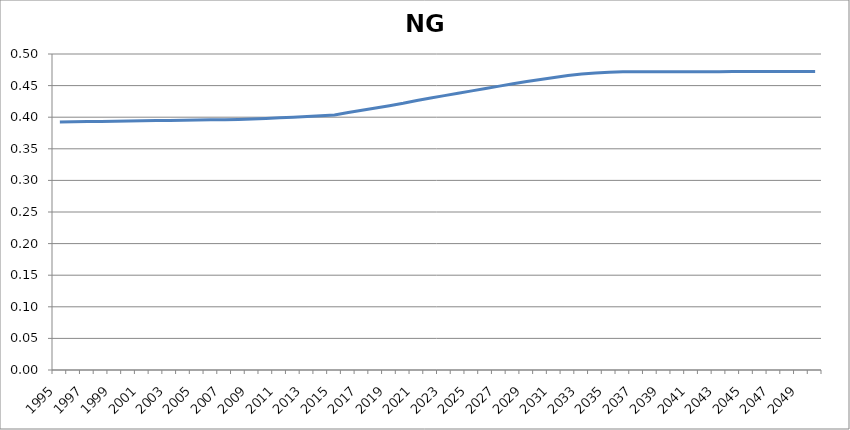
| Category | NGDryer |
|---|---|
| 1995.0 | 0.392 |
| 1996.0 | 0.393 |
| 1997.0 | 0.393 |
| 1998.0 | 0.393 |
| 1999.0 | 0.394 |
| 2000.0 | 0.394 |
| 2001.0 | 0.394 |
| 2002.0 | 0.395 |
| 2003.0 | 0.395 |
| 2004.0 | 0.395 |
| 2005.0 | 0.396 |
| 2006.0 | 0.396 |
| 2007.0 | 0.396 |
| 2008.0 | 0.396 |
| 2009.0 | 0.397 |
| 2010.0 | 0.398 |
| 2011.0 | 0.399 |
| 2012.0 | 0.4 |
| 2013.0 | 0.401 |
| 2014.0 | 0.402 |
| 2015.0 | 0.404 |
| 2016.0 | 0.407 |
| 2017.0 | 0.411 |
| 2018.0 | 0.415 |
| 2019.0 | 0.418 |
| 2020.0 | 0.422 |
| 2021.0 | 0.426 |
| 2022.0 | 0.43 |
| 2023.0 | 0.434 |
| 2024.0 | 0.438 |
| 2025.0 | 0.442 |
| 2026.0 | 0.445 |
| 2027.0 | 0.449 |
| 2028.0 | 0.453 |
| 2029.0 | 0.456 |
| 2030.0 | 0.46 |
| 2031.0 | 0.463 |
| 2032.0 | 0.466 |
| 2033.0 | 0.468 |
| 2034.0 | 0.47 |
| 2035.0 | 0.471 |
| 2036.0 | 0.472 |
| 2037.0 | 0.472 |
| 2038.0 | 0.472 |
| 2039.0 | 0.472 |
| 2040.0 | 0.472 |
| 2041.0 | 0.472 |
| 2042.0 | 0.472 |
| 2043.0 | 0.472 |
| 2044.0 | 0.472 |
| 2045.0 | 0.472 |
| 2046.0 | 0.472 |
| 2047.0 | 0.472 |
| 2048.0 | 0.472 |
| 2049.0 | 0.472 |
| 2050.0 | 0.472 |